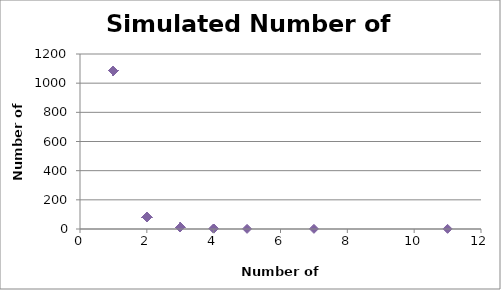
| Category | Simulated Number of Athletes |
|---|---|
| 11.0 | 1 |
| 7.0 | 1 |
| 5.0 | 1 |
| 4.0 | 3 |
| 4.0 | 3 |
| 4.0 | 3 |
| 3.0 | 12 |
| 3.0 | 12 |
| 3.0 | 12 |
| 3.0 | 12 |
| 3.0 | 12 |
| 3.0 | 12 |
| 3.0 | 12 |
| 3.0 | 12 |
| 3.0 | 12 |
| 3.0 | 12 |
| 3.0 | 12 |
| 3.0 | 12 |
| 2.0 | 81 |
| 2.0 | 81 |
| 2.0 | 81 |
| 2.0 | 81 |
| 2.0 | 81 |
| 2.0 | 81 |
| 2.0 | 81 |
| 2.0 | 81 |
| 2.0 | 81 |
| 2.0 | 81 |
| 2.0 | 81 |
| 2.0 | 81 |
| 2.0 | 81 |
| 2.0 | 81 |
| 2.0 | 81 |
| 2.0 | 81 |
| 2.0 | 81 |
| 2.0 | 81 |
| 2.0 | 81 |
| 2.0 | 81 |
| 2.0 | 81 |
| 2.0 | 81 |
| 2.0 | 81 |
| 2.0 | 81 |
| 2.0 | 81 |
| 2.0 | 81 |
| 2.0 | 81 |
| 2.0 | 81 |
| 2.0 | 81 |
| 2.0 | 81 |
| 2.0 | 81 |
| 2.0 | 81 |
| 2.0 | 81 |
| 2.0 | 81 |
| 2.0 | 81 |
| 2.0 | 81 |
| 2.0 | 81 |
| 2.0 | 81 |
| 2.0 | 81 |
| 2.0 | 81 |
| 2.0 | 81 |
| 2.0 | 81 |
| 2.0 | 81 |
| 2.0 | 81 |
| 2.0 | 81 |
| 2.0 | 81 |
| 2.0 | 81 |
| 2.0 | 81 |
| 2.0 | 81 |
| 2.0 | 81 |
| 2.0 | 81 |
| 2.0 | 81 |
| 2.0 | 81 |
| 2.0 | 81 |
| 2.0 | 81 |
| 2.0 | 81 |
| 2.0 | 81 |
| 2.0 | 81 |
| 2.0 | 81 |
| 2.0 | 81 |
| 2.0 | 81 |
| 2.0 | 81 |
| 2.0 | 81 |
| 2.0 | 81 |
| 2.0 | 81 |
| 2.0 | 81 |
| 2.0 | 81 |
| 2.0 | 81 |
| 2.0 | 81 |
| 2.0 | 81 |
| 2.0 | 81 |
| 2.0 | 81 |
| 2.0 | 81 |
| 2.0 | 81 |
| 2.0 | 81 |
| 2.0 | 81 |
| 2.0 | 81 |
| 2.0 | 81 |
| 2.0 | 81 |
| 2.0 | 81 |
| 2.0 | 81 |
| 1.0 | 1084 |
| 1.0 | 1084 |
| 1.0 | 1084 |
| 1.0 | 1084 |
| 1.0 | 1084 |
| 1.0 | 1084 |
| 1.0 | 1084 |
| 1.0 | 1084 |
| 1.0 | 1084 |
| 1.0 | 1084 |
| 1.0 | 1084 |
| 1.0 | 1084 |
| 1.0 | 1084 |
| 1.0 | 1084 |
| 1.0 | 1084 |
| 1.0 | 1084 |
| 1.0 | 1084 |
| 1.0 | 1084 |
| 1.0 | 1084 |
| 1.0 | 1084 |
| 1.0 | 1084 |
| 1.0 | 1084 |
| 1.0 | 1084 |
| 1.0 | 1084 |
| 1.0 | 1084 |
| 1.0 | 1084 |
| 1.0 | 1084 |
| 1.0 | 1084 |
| 1.0 | 1084 |
| 1.0 | 1084 |
| 1.0 | 1084 |
| 1.0 | 1084 |
| 1.0 | 1084 |
| 1.0 | 1084 |
| 1.0 | 1084 |
| 1.0 | 1084 |
| 1.0 | 1084 |
| 1.0 | 1084 |
| 1.0 | 1084 |
| 1.0 | 1084 |
| 1.0 | 1084 |
| 1.0 | 1084 |
| 1.0 | 1084 |
| 1.0 | 1084 |
| 1.0 | 1084 |
| 1.0 | 1084 |
| 1.0 | 1084 |
| 1.0 | 1084 |
| 1.0 | 1084 |
| 1.0 | 1084 |
| 1.0 | 1084 |
| 1.0 | 1084 |
| 1.0 | 1084 |
| 1.0 | 1084 |
| 1.0 | 1084 |
| 1.0 | 1084 |
| 1.0 | 1084 |
| 1.0 | 1084 |
| 1.0 | 1084 |
| 1.0 | 1084 |
| 1.0 | 1084 |
| 1.0 | 1084 |
| 1.0 | 1084 |
| 1.0 | 1084 |
| 1.0 | 1084 |
| 1.0 | 1084 |
| 1.0 | 1084 |
| 1.0 | 1084 |
| 1.0 | 1084 |
| 1.0 | 1084 |
| 1.0 | 1084 |
| 1.0 | 1084 |
| 1.0 | 1084 |
| 1.0 | 1084 |
| 1.0 | 1084 |
| 1.0 | 1084 |
| 1.0 | 1084 |
| 1.0 | 1084 |
| 1.0 | 1084 |
| 1.0 | 1084 |
| 1.0 | 1084 |
| 1.0 | 1084 |
| 1.0 | 1084 |
| 1.0 | 1084 |
| 1.0 | 1084 |
| 1.0 | 1084 |
| 1.0 | 1084 |
| 1.0 | 1084 |
| 1.0 | 1084 |
| 1.0 | 1084 |
| 1.0 | 1084 |
| 1.0 | 1084 |
| 1.0 | 1084 |
| 1.0 | 1084 |
| 1.0 | 1084 |
| 1.0 | 1084 |
| 1.0 | 1084 |
| 1.0 | 1084 |
| 1.0 | 1084 |
| 1.0 | 1084 |
| 1.0 | 1084 |
| 1.0 | 1084 |
| 1.0 | 1084 |
| 1.0 | 1084 |
| 1.0 | 1084 |
| 1.0 | 1084 |
| 1.0 | 1084 |
| 1.0 | 1084 |
| 1.0 | 1084 |
| 1.0 | 1084 |
| 1.0 | 1084 |
| 1.0 | 1084 |
| 1.0 | 1084 |
| 1.0 | 1084 |
| 1.0 | 1084 |
| 1.0 | 1084 |
| 1.0 | 1084 |
| 1.0 | 1084 |
| 1.0 | 1084 |
| 1.0 | 1084 |
| 1.0 | 1084 |
| 1.0 | 1084 |
| 1.0 | 1084 |
| 1.0 | 1084 |
| 1.0 | 1084 |
| 1.0 | 1084 |
| 1.0 | 1084 |
| 1.0 | 1084 |
| 1.0 | 1084 |
| 1.0 | 1084 |
| 1.0 | 1084 |
| 1.0 | 1084 |
| 1.0 | 1084 |
| 1.0 | 1084 |
| 1.0 | 1084 |
| 1.0 | 1084 |
| 1.0 | 1084 |
| 1.0 | 1084 |
| 1.0 | 1084 |
| 1.0 | 1084 |
| 1.0 | 1084 |
| 1.0 | 1084 |
| 1.0 | 1084 |
| 1.0 | 1084 |
| 1.0 | 1084 |
| 1.0 | 1084 |
| 1.0 | 1084 |
| 1.0 | 1084 |
| 1.0 | 1084 |
| 1.0 | 1084 |
| 1.0 | 1084 |
| 1.0 | 1084 |
| 1.0 | 1084 |
| 1.0 | 1084 |
| 1.0 | 1084 |
| 1.0 | 1084 |
| 1.0 | 1084 |
| 1.0 | 1084 |
| 1.0 | 1084 |
| 1.0 | 1084 |
| 1.0 | 1084 |
| 1.0 | 1084 |
| 1.0 | 1084 |
| 1.0 | 1084 |
| 1.0 | 1084 |
| 1.0 | 1084 |
| 1.0 | 1084 |
| 1.0 | 1084 |
| 1.0 | 1084 |
| 1.0 | 1084 |
| 1.0 | 1084 |
| 1.0 | 1084 |
| 1.0 | 1084 |
| 1.0 | 1084 |
| 1.0 | 1084 |
| 1.0 | 1084 |
| 1.0 | 1084 |
| 1.0 | 1084 |
| 1.0 | 1084 |
| 1.0 | 1084 |
| 1.0 | 1084 |
| 1.0 | 1084 |
| 1.0 | 1084 |
| 1.0 | 1084 |
| 1.0 | 1084 |
| 1.0 | 1084 |
| 1.0 | 1084 |
| 1.0 | 1084 |
| 1.0 | 1084 |
| 1.0 | 1084 |
| 1.0 | 1084 |
| 1.0 | 1084 |
| 1.0 | 1084 |
| 1.0 | 1084 |
| 1.0 | 1084 |
| 1.0 | 1084 |
| 1.0 | 1084 |
| 1.0 | 1084 |
| 1.0 | 1084 |
| 1.0 | 1084 |
| 1.0 | 1084 |
| 1.0 | 1084 |
| 1.0 | 1084 |
| 1.0 | 1084 |
| 1.0 | 1084 |
| 1.0 | 1084 |
| 1.0 | 1084 |
| 1.0 | 1084 |
| 1.0 | 1084 |
| 1.0 | 1084 |
| 1.0 | 1084 |
| 1.0 | 1084 |
| 1.0 | 1084 |
| 1.0 | 1084 |
| 1.0 | 1084 |
| 1.0 | 1084 |
| 1.0 | 1084 |
| 1.0 | 1084 |
| 1.0 | 1084 |
| 1.0 | 1084 |
| 1.0 | 1084 |
| 1.0 | 1084 |
| 1.0 | 1084 |
| 1.0 | 1084 |
| 1.0 | 1084 |
| 1.0 | 1084 |
| 1.0 | 1084 |
| 1.0 | 1084 |
| 1.0 | 1084 |
| 1.0 | 1084 |
| 1.0 | 1084 |
| 1.0 | 1084 |
| 1.0 | 1084 |
| 1.0 | 1084 |
| 1.0 | 1084 |
| 1.0 | 1084 |
| 1.0 | 1084 |
| 1.0 | 1084 |
| 1.0 | 1084 |
| 1.0 | 1084 |
| 1.0 | 1084 |
| 1.0 | 1084 |
| 1.0 | 1084 |
| 1.0 | 1084 |
| 1.0 | 1084 |
| 1.0 | 1084 |
| 1.0 | 1084 |
| 1.0 | 1084 |
| 1.0 | 1084 |
| 1.0 | 1084 |
| 1.0 | 1084 |
| 1.0 | 1084 |
| 1.0 | 1084 |
| 1.0 | 1084 |
| 1.0 | 1084 |
| 1.0 | 1084 |
| 1.0 | 1084 |
| 1.0 | 1084 |
| 1.0 | 1084 |
| 1.0 | 1084 |
| 1.0 | 1084 |
| 1.0 | 1084 |
| 1.0 | 1084 |
| 1.0 | 1084 |
| 1.0 | 1084 |
| 1.0 | 1084 |
| 1.0 | 1084 |
| 1.0 | 1084 |
| 1.0 | 1084 |
| 1.0 | 1084 |
| 1.0 | 1084 |
| 1.0 | 1084 |
| 1.0 | 1084 |
| 1.0 | 1084 |
| 1.0 | 1084 |
| 1.0 | 1084 |
| 1.0 | 1084 |
| 1.0 | 1084 |
| 1.0 | 1084 |
| 1.0 | 1084 |
| 1.0 | 1084 |
| 1.0 | 1084 |
| 1.0 | 1084 |
| 1.0 | 1084 |
| 1.0 | 1084 |
| 1.0 | 1084 |
| 1.0 | 1084 |
| 1.0 | 1084 |
| 1.0 | 1084 |
| 1.0 | 1084 |
| 1.0 | 1084 |
| 1.0 | 1084 |
| 1.0 | 1084 |
| 1.0 | 1084 |
| 1.0 | 1084 |
| 1.0 | 1084 |
| 1.0 | 1084 |
| 1.0 | 1084 |
| 1.0 | 1084 |
| 1.0 | 1084 |
| 1.0 | 1084 |
| 1.0 | 1084 |
| 1.0 | 1084 |
| 1.0 | 1084 |
| 1.0 | 1084 |
| 1.0 | 1084 |
| 1.0 | 1084 |
| 1.0 | 1084 |
| 1.0 | 1084 |
| 1.0 | 1084 |
| 1.0 | 1084 |
| 1.0 | 1084 |
| 1.0 | 1084 |
| 1.0 | 1084 |
| 1.0 | 1084 |
| 1.0 | 1084 |
| 1.0 | 1084 |
| 1.0 | 1084 |
| 1.0 | 1084 |
| 1.0 | 1084 |
| 1.0 | 1084 |
| 1.0 | 1084 |
| 1.0 | 1084 |
| 1.0 | 1084 |
| 1.0 | 1084 |
| 1.0 | 1084 |
| 1.0 | 1084 |
| 1.0 | 1084 |
| 1.0 | 1084 |
| 1.0 | 1084 |
| 1.0 | 1084 |
| 1.0 | 1084 |
| 1.0 | 1084 |
| 1.0 | 1084 |
| 1.0 | 1084 |
| 1.0 | 1084 |
| 1.0 | 1084 |
| 1.0 | 1084 |
| 1.0 | 1084 |
| 1.0 | 1084 |
| 1.0 | 1084 |
| 1.0 | 1084 |
| 1.0 | 1084 |
| 1.0 | 1084 |
| 1.0 | 1084 |
| 1.0 | 1084 |
| 1.0 | 1084 |
| 1.0 | 1084 |
| 1.0 | 1084 |
| 1.0 | 1084 |
| 1.0 | 1084 |
| 1.0 | 1084 |
| 1.0 | 1084 |
| 1.0 | 1084 |
| 1.0 | 1084 |
| 1.0 | 1084 |
| 1.0 | 1084 |
| 1.0 | 1084 |
| 1.0 | 1084 |
| 1.0 | 1084 |
| 1.0 | 1084 |
| 1.0 | 1084 |
| 1.0 | 1084 |
| 1.0 | 1084 |
| 1.0 | 1084 |
| 1.0 | 1084 |
| 1.0 | 1084 |
| 1.0 | 1084 |
| 1.0 | 1084 |
| 1.0 | 1084 |
| 1.0 | 1084 |
| 1.0 | 1084 |
| 1.0 | 1084 |
| 1.0 | 1084 |
| 1.0 | 1084 |
| 1.0 | 1084 |
| 1.0 | 1084 |
| 1.0 | 1084 |
| 1.0 | 1084 |
| 1.0 | 1084 |
| 1.0 | 1084 |
| 1.0 | 1084 |
| 1.0 | 1084 |
| 1.0 | 1084 |
| 1.0 | 1084 |
| 1.0 | 1084 |
| 1.0 | 1084 |
| 1.0 | 1084 |
| 1.0 | 1084 |
| 1.0 | 1084 |
| 1.0 | 1084 |
| 1.0 | 1084 |
| 1.0 | 1084 |
| 1.0 | 1084 |
| 1.0 | 1084 |
| 1.0 | 1084 |
| 1.0 | 1084 |
| 1.0 | 1084 |
| 1.0 | 1084 |
| 1.0 | 1084 |
| 1.0 | 1084 |
| 1.0 | 1084 |
| 1.0 | 1084 |
| 1.0 | 1084 |
| 1.0 | 1084 |
| 1.0 | 1084 |
| 1.0 | 1084 |
| 1.0 | 1084 |
| 1.0 | 1084 |
| 1.0 | 1084 |
| 1.0 | 1084 |
| 1.0 | 1084 |
| 1.0 | 1084 |
| 1.0 | 1084 |
| 1.0 | 1084 |
| 1.0 | 1084 |
| 1.0 | 1084 |
| 1.0 | 1084 |
| 1.0 | 1084 |
| 1.0 | 1084 |
| 1.0 | 1084 |
| 1.0 | 1084 |
| 1.0 | 1084 |
| 1.0 | 1084 |
| 1.0 | 1084 |
| 1.0 | 1084 |
| 1.0 | 1084 |
| 1.0 | 1084 |
| 1.0 | 1084 |
| 1.0 | 1084 |
| 1.0 | 1084 |
| 1.0 | 1084 |
| 1.0 | 1084 |
| 1.0 | 1084 |
| 1.0 | 1084 |
| 1.0 | 1084 |
| 1.0 | 1084 |
| 1.0 | 1084 |
| 1.0 | 1084 |
| 1.0 | 1084 |
| 1.0 | 1084 |
| 1.0 | 1084 |
| 1.0 | 1084 |
| 1.0 | 1084 |
| 1.0 | 1084 |
| 1.0 | 1084 |
| 1.0 | 1084 |
| 1.0 | 1084 |
| 1.0 | 1084 |
| 1.0 | 1084 |
| 1.0 | 1084 |
| 1.0 | 1084 |
| 1.0 | 1084 |
| 1.0 | 1084 |
| 1.0 | 1084 |
| 1.0 | 1084 |
| 1.0 | 1084 |
| 1.0 | 1084 |
| 1.0 | 1084 |
| 1.0 | 1084 |
| 1.0 | 1084 |
| 1.0 | 1084 |
| 1.0 | 1084 |
| 1.0 | 1084 |
| 1.0 | 1084 |
| 1.0 | 1084 |
| 1.0 | 1084 |
| 1.0 | 1084 |
| 1.0 | 1084 |
| 1.0 | 1084 |
| 1.0 | 1084 |
| 1.0 | 1084 |
| 1.0 | 1084 |
| 1.0 | 1084 |
| 1.0 | 1084 |
| 1.0 | 1084 |
| 1.0 | 1084 |
| 1.0 | 1084 |
| 1.0 | 1084 |
| 1.0 | 1084 |
| 1.0 | 1084 |
| 1.0 | 1084 |
| 1.0 | 1084 |
| 1.0 | 1084 |
| 1.0 | 1084 |
| 1.0 | 1084 |
| 1.0 | 1084 |
| 1.0 | 1084 |
| 1.0 | 1084 |
| 1.0 | 1084 |
| 1.0 | 1084 |
| 1.0 | 1084 |
| 1.0 | 1084 |
| 1.0 | 1084 |
| 1.0 | 1084 |
| 1.0 | 1084 |
| 1.0 | 1084 |
| 1.0 | 1084 |
| 1.0 | 1084 |
| 1.0 | 1084 |
| 1.0 | 1084 |
| 1.0 | 1084 |
| 1.0 | 1084 |
| 1.0 | 1084 |
| 1.0 | 1084 |
| 1.0 | 1084 |
| 1.0 | 1084 |
| 1.0 | 1084 |
| 1.0 | 1084 |
| 1.0 | 1084 |
| 1.0 | 1084 |
| 1.0 | 1084 |
| 1.0 | 1084 |
| 1.0 | 1084 |
| 1.0 | 1084 |
| 1.0 | 1084 |
| 1.0 | 1084 |
| 1.0 | 1084 |
| 1.0 | 1084 |
| 1.0 | 1084 |
| 1.0 | 1084 |
| 1.0 | 1084 |
| 1.0 | 1084 |
| 1.0 | 1084 |
| 1.0 | 1084 |
| 1.0 | 1084 |
| 1.0 | 1084 |
| 1.0 | 1084 |
| 1.0 | 1084 |
| 1.0 | 1084 |
| 1.0 | 1084 |
| 1.0 | 1084 |
| 1.0 | 1084 |
| 1.0 | 1084 |
| 1.0 | 1084 |
| 1.0 | 1084 |
| 1.0 | 1084 |
| 1.0 | 1084 |
| 1.0 | 1084 |
| 1.0 | 1084 |
| 1.0 | 1084 |
| 1.0 | 1084 |
| 1.0 | 1084 |
| 1.0 | 1084 |
| 1.0 | 1084 |
| 1.0 | 1084 |
| 1.0 | 1084 |
| 1.0 | 1084 |
| 1.0 | 1084 |
| 1.0 | 1084 |
| 1.0 | 1084 |
| 1.0 | 1084 |
| 1.0 | 1084 |
| 1.0 | 1084 |
| 1.0 | 1084 |
| 1.0 | 1084 |
| 1.0 | 1084 |
| 1.0 | 1084 |
| 1.0 | 1084 |
| 1.0 | 1084 |
| 1.0 | 1084 |
| 1.0 | 1084 |
| 1.0 | 1084 |
| 1.0 | 1084 |
| 1.0 | 1084 |
| 1.0 | 1084 |
| 1.0 | 1084 |
| 1.0 | 1084 |
| 1.0 | 1084 |
| 1.0 | 1084 |
| 1.0 | 1084 |
| 1.0 | 1084 |
| 1.0 | 1084 |
| 1.0 | 1084 |
| 1.0 | 1084 |
| 1.0 | 1084 |
| 1.0 | 1084 |
| 1.0 | 1084 |
| 1.0 | 1084 |
| 1.0 | 1084 |
| 1.0 | 1084 |
| 1.0 | 1084 |
| 1.0 | 1084 |
| 1.0 | 1084 |
| 1.0 | 1084 |
| 1.0 | 1084 |
| 1.0 | 1084 |
| 1.0 | 1084 |
| 1.0 | 1084 |
| 1.0 | 1084 |
| 1.0 | 1084 |
| 1.0 | 1084 |
| 1.0 | 1084 |
| 1.0 | 1084 |
| 1.0 | 1084 |
| 1.0 | 1084 |
| 1.0 | 1084 |
| 1.0 | 1084 |
| 1.0 | 1084 |
| 1.0 | 1084 |
| 1.0 | 1084 |
| 1.0 | 1084 |
| 1.0 | 1084 |
| 1.0 | 1084 |
| 1.0 | 1084 |
| 1.0 | 1084 |
| 1.0 | 1084 |
| 1.0 | 1084 |
| 1.0 | 1084 |
| 1.0 | 1084 |
| 1.0 | 1084 |
| 1.0 | 1084 |
| 1.0 | 1084 |
| 1.0 | 1084 |
| 1.0 | 1084 |
| 1.0 | 1084 |
| 1.0 | 1084 |
| 1.0 | 1084 |
| 1.0 | 1084 |
| 1.0 | 1084 |
| 1.0 | 1084 |
| 1.0 | 1084 |
| 1.0 | 1084 |
| 1.0 | 1084 |
| 1.0 | 1084 |
| 1.0 | 1084 |
| 1.0 | 1084 |
| 1.0 | 1084 |
| 1.0 | 1084 |
| 1.0 | 1084 |
| 1.0 | 1084 |
| 1.0 | 1084 |
| 1.0 | 1084 |
| 1.0 | 1084 |
| 1.0 | 1084 |
| 1.0 | 1084 |
| 1.0 | 1084 |
| 1.0 | 1084 |
| 1.0 | 1084 |
| 1.0 | 1084 |
| 1.0 | 1084 |
| 1.0 | 1084 |
| 1.0 | 1084 |
| 1.0 | 1084 |
| 1.0 | 1084 |
| 1.0 | 1084 |
| 1.0 | 1084 |
| 1.0 | 1084 |
| 1.0 | 1084 |
| 1.0 | 1084 |
| 1.0 | 1084 |
| 1.0 | 1084 |
| 1.0 | 1084 |
| 1.0 | 1084 |
| 1.0 | 1084 |
| 1.0 | 1084 |
| 1.0 | 1084 |
| 1.0 | 1084 |
| 1.0 | 1084 |
| 1.0 | 1084 |
| 1.0 | 1084 |
| 1.0 | 1084 |
| 1.0 | 1084 |
| 1.0 | 1084 |
| 1.0 | 1084 |
| 1.0 | 1084 |
| 1.0 | 1084 |
| 1.0 | 1084 |
| 1.0 | 1084 |
| 1.0 | 1084 |
| 1.0 | 1084 |
| 1.0 | 1084 |
| 1.0 | 1084 |
| 1.0 | 1084 |
| 1.0 | 1084 |
| 1.0 | 1084 |
| 1.0 | 1084 |
| 1.0 | 1084 |
| 1.0 | 1084 |
| 1.0 | 1084 |
| 1.0 | 1084 |
| 1.0 | 1084 |
| 1.0 | 1084 |
| 1.0 | 1084 |
| 1.0 | 1084 |
| 1.0 | 1084 |
| 1.0 | 1084 |
| 1.0 | 1084 |
| 1.0 | 1084 |
| 1.0 | 1084 |
| 1.0 | 1084 |
| 1.0 | 1084 |
| 1.0 | 1084 |
| 1.0 | 1084 |
| 1.0 | 1084 |
| 1.0 | 1084 |
| 1.0 | 1084 |
| 1.0 | 1084 |
| 1.0 | 1084 |
| 1.0 | 1084 |
| 1.0 | 1084 |
| 1.0 | 1084 |
| 1.0 | 1084 |
| 1.0 | 1084 |
| 1.0 | 1084 |
| 1.0 | 1084 |
| 1.0 | 1084 |
| 1.0 | 1084 |
| 1.0 | 1084 |
| 1.0 | 1084 |
| 1.0 | 1084 |
| 1.0 | 1084 |
| 1.0 | 1084 |
| 1.0 | 1084 |
| 1.0 | 1084 |
| 1.0 | 1084 |
| 1.0 | 1084 |
| 1.0 | 1084 |
| 1.0 | 1084 |
| 1.0 | 1084 |
| 1.0 | 1084 |
| 1.0 | 1084 |
| 1.0 | 1084 |
| 1.0 | 1084 |
| 1.0 | 1084 |
| 1.0 | 1084 |
| 1.0 | 1084 |
| 1.0 | 1084 |
| 1.0 | 1084 |
| 1.0 | 1084 |
| 1.0 | 1084 |
| 1.0 | 1084 |
| 1.0 | 1084 |
| 1.0 | 1084 |
| 1.0 | 1084 |
| 1.0 | 1084 |
| 1.0 | 1084 |
| 1.0 | 1084 |
| 1.0 | 1084 |
| 1.0 | 1084 |
| 1.0 | 1084 |
| 1.0 | 1084 |
| 1.0 | 1084 |
| 1.0 | 1084 |
| 1.0 | 1084 |
| 1.0 | 1084 |
| 1.0 | 1084 |
| 1.0 | 1084 |
| 1.0 | 1084 |
| 1.0 | 1084 |
| 1.0 | 1084 |
| 1.0 | 1084 |
| 1.0 | 1084 |
| 1.0 | 1084 |
| 1.0 | 1084 |
| 1.0 | 1084 |
| 1.0 | 1084 |
| 1.0 | 1084 |
| 1.0 | 1084 |
| 1.0 | 1084 |
| 1.0 | 1084 |
| 1.0 | 1084 |
| 1.0 | 1084 |
| 1.0 | 1084 |
| 1.0 | 1084 |
| 1.0 | 1084 |
| 1.0 | 1084 |
| 1.0 | 1084 |
| 1.0 | 1084 |
| 1.0 | 1084 |
| 1.0 | 1084 |
| 1.0 | 1084 |
| 1.0 | 1084 |
| 1.0 | 1084 |
| 1.0 | 1084 |
| 1.0 | 1084 |
| 1.0 | 1084 |
| 1.0 | 1084 |
| 1.0 | 1084 |
| 1.0 | 1084 |
| 1.0 | 1084 |
| 1.0 | 1084 |
| 1.0 | 1084 |
| 1.0 | 1084 |
| 1.0 | 1084 |
| 1.0 | 1084 |
| 1.0 | 1084 |
| 1.0 | 1084 |
| 1.0 | 1084 |
| 1.0 | 1084 |
| 1.0 | 1084 |
| 1.0 | 1084 |
| 1.0 | 1084 |
| 1.0 | 1084 |
| 1.0 | 1084 |
| 1.0 | 1084 |
| 1.0 | 1084 |
| 1.0 | 1084 |
| 1.0 | 1084 |
| 1.0 | 1084 |
| 1.0 | 1084 |
| 1.0 | 1084 |
| 1.0 | 1084 |
| 1.0 | 1084 |
| 1.0 | 1084 |
| 1.0 | 1084 |
| 1.0 | 1084 |
| 1.0 | 1084 |
| 1.0 | 1084 |
| 1.0 | 1084 |
| 1.0 | 1084 |
| 1.0 | 1084 |
| 1.0 | 1084 |
| 1.0 | 1084 |
| 1.0 | 1084 |
| 1.0 | 1084 |
| 1.0 | 1084 |
| 1.0 | 1084 |
| 1.0 | 1084 |
| 1.0 | 1084 |
| 1.0 | 1084 |
| 1.0 | 1084 |
| 1.0 | 1084 |
| 1.0 | 1084 |
| 1.0 | 1084 |
| 1.0 | 1084 |
| 1.0 | 1084 |
| 1.0 | 1084 |
| 1.0 | 1084 |
| 1.0 | 1084 |
| 1.0 | 1084 |
| 1.0 | 1084 |
| 1.0 | 1084 |
| 1.0 | 1084 |
| 1.0 | 1084 |
| 1.0 | 1084 |
| 1.0 | 1084 |
| 1.0 | 1084 |
| 1.0 | 1084 |
| 1.0 | 1084 |
| 1.0 | 1084 |
| 1.0 | 1084 |
| 1.0 | 1084 |
| 1.0 | 1084 |
| 1.0 | 1084 |
| 1.0 | 1084 |
| 1.0 | 1084 |
| 1.0 | 1084 |
| 1.0 | 1084 |
| 1.0 | 1084 |
| 1.0 | 1084 |
| 1.0 | 1084 |
| 1.0 | 1084 |
| 1.0 | 1084 |
| 1.0 | 1084 |
| 1.0 | 1084 |
| 1.0 | 1084 |
| 1.0 | 1084 |
| 1.0 | 1084 |
| 1.0 | 1084 |
| 1.0 | 1084 |
| 1.0 | 1084 |
| 1.0 | 1084 |
| 1.0 | 1084 |
| 1.0 | 1084 |
| 1.0 | 1084 |
| 1.0 | 1084 |
| 1.0 | 1084 |
| 1.0 | 1084 |
| 1.0 | 1084 |
| 1.0 | 1084 |
| 1.0 | 1084 |
| 1.0 | 1084 |
| 1.0 | 1084 |
| 1.0 | 1084 |
| 1.0 | 1084 |
| 1.0 | 1084 |
| 1.0 | 1084 |
| 1.0 | 1084 |
| 1.0 | 1084 |
| 1.0 | 1084 |
| 1.0 | 1084 |
| 1.0 | 1084 |
| 1.0 | 1084 |
| 1.0 | 1084 |
| 1.0 | 1084 |
| 1.0 | 1084 |
| 1.0 | 1084 |
| 1.0 | 1084 |
| 1.0 | 1084 |
| 1.0 | 1084 |
| 1.0 | 1084 |
| 1.0 | 1084 |
| 1.0 | 1084 |
| 1.0 | 1084 |
| 1.0 | 1084 |
| 1.0 | 1084 |
| 1.0 | 1084 |
| 1.0 | 1084 |
| 1.0 | 1084 |
| 1.0 | 1084 |
| 1.0 | 1084 |
| 1.0 | 1084 |
| 1.0 | 1084 |
| 1.0 | 1084 |
| 1.0 | 1084 |
| 1.0 | 1084 |
| 1.0 | 1084 |
| 1.0 | 1084 |
| 1.0 | 1084 |
| 1.0 | 1084 |
| 1.0 | 1084 |
| 1.0 | 1084 |
| 1.0 | 1084 |
| 1.0 | 1084 |
| 1.0 | 1084 |
| 1.0 | 1084 |
| 1.0 | 1084 |
| 1.0 | 1084 |
| 1.0 | 1084 |
| 1.0 | 1084 |
| 1.0 | 1084 |
| 1.0 | 1084 |
| 1.0 | 1084 |
| 1.0 | 1084 |
| 1.0 | 1084 |
| 1.0 | 1084 |
| 1.0 | 1084 |
| 1.0 | 1084 |
| 1.0 | 1084 |
| 1.0 | 1084 |
| 1.0 | 1084 |
| 1.0 | 1084 |
| 1.0 | 1084 |
| 1.0 | 1084 |
| 1.0 | 1084 |
| 1.0 | 1084 |
| 1.0 | 1084 |
| 1.0 | 1084 |
| 1.0 | 1084 |
| 1.0 | 1084 |
| 1.0 | 1084 |
| 1.0 | 1084 |
| 1.0 | 1084 |
| 1.0 | 1084 |
| 1.0 | 1084 |
| 1.0 | 1084 |
| 1.0 | 1084 |
| 1.0 | 1084 |
| 1.0 | 1084 |
| 1.0 | 1084 |
| 1.0 | 1084 |
| 1.0 | 1084 |
| 1.0 | 1084 |
| 1.0 | 1084 |
| 1.0 | 1084 |
| 1.0 | 1084 |
| 1.0 | 1084 |
| 1.0 | 1084 |
| 1.0 | 1084 |
| 1.0 | 1084 |
| 1.0 | 1084 |
| 1.0 | 1084 |
| 1.0 | 1084 |
| 1.0 | 1084 |
| 1.0 | 1084 |
| 1.0 | 1084 |
| 1.0 | 1084 |
| 1.0 | 1084 |
| 1.0 | 1084 |
| 1.0 | 1084 |
| 1.0 | 1084 |
| 1.0 | 1084 |
| 1.0 | 1084 |
| 1.0 | 1084 |
| 1.0 | 1084 |
| 1.0 | 1084 |
| 1.0 | 1084 |
| 1.0 | 1084 |
| 1.0 | 1084 |
| 1.0 | 1084 |
| 1.0 | 1084 |
| 1.0 | 1084 |
| 1.0 | 1084 |
| 1.0 | 1084 |
| 1.0 | 1084 |
| 1.0 | 1084 |
| 1.0 | 1084 |
| 1.0 | 1084 |
| 1.0 | 1084 |
| 1.0 | 1084 |
| 1.0 | 1084 |
| 1.0 | 1084 |
| 1.0 | 1084 |
| 1.0 | 1084 |
| 1.0 | 1084 |
| 1.0 | 1084 |
| 1.0 | 1084 |
| 1.0 | 1084 |
| 1.0 | 1084 |
| 1.0 | 1084 |
| 1.0 | 1084 |
| 1.0 | 1084 |
| 1.0 | 1084 |
| 1.0 | 1084 |
| 1.0 | 1084 |
| 1.0 | 1084 |
| 1.0 | 1084 |
| 1.0 | 1084 |
| 1.0 | 1084 |
| 1.0 | 1084 |
| 1.0 | 1084 |
| 1.0 | 1084 |
| 1.0 | 1084 |
| 1.0 | 1084 |
| 1.0 | 1084 |
| 1.0 | 1084 |
| 1.0 | 1084 |
| 1.0 | 1084 |
| 1.0 | 1084 |
| 1.0 | 1084 |
| 1.0 | 1084 |
| 1.0 | 1084 |
| 1.0 | 1084 |
| 1.0 | 1084 |
| 1.0 | 1084 |
| 1.0 | 1084 |
| 1.0 | 1084 |
| 1.0 | 1084 |
| 1.0 | 1084 |
| 1.0 | 1084 |
| 1.0 | 1084 |
| 1.0 | 1084 |
| 1.0 | 1084 |
| 1.0 | 1084 |
| 1.0 | 1084 |
| 1.0 | 1084 |
| 1.0 | 1084 |
| 1.0 | 1084 |
| 1.0 | 1084 |
| 1.0 | 1084 |
| 1.0 | 1084 |
| 1.0 | 1084 |
| 1.0 | 1084 |
| 1.0 | 1084 |
| 1.0 | 1084 |
| 1.0 | 1084 |
| 1.0 | 1084 |
| 1.0 | 1084 |
| 1.0 | 1084 |
| 1.0 | 1084 |
| 1.0 | 1084 |
| 1.0 | 1084 |
| 1.0 | 1084 |
| 1.0 | 1084 |
| 1.0 | 1084 |
| 1.0 | 1084 |
| 1.0 | 1084 |
| 1.0 | 1084 |
| 1.0 | 1084 |
| 1.0 | 1084 |
| 1.0 | 1084 |
| 1.0 | 1084 |
| 1.0 | 1084 |
| 1.0 | 1084 |
| 1.0 | 1084 |
| 1.0 | 1084 |
| 1.0 | 1084 |
| 1.0 | 1084 |
| 1.0 | 1084 |
| 1.0 | 1084 |
| 1.0 | 1084 |
| 1.0 | 1084 |
| 1.0 | 1084 |
| 1.0 | 1084 |
| 1.0 | 1084 |
| 1.0 | 1084 |
| 1.0 | 1084 |
| 1.0 | 1084 |
| 1.0 | 1084 |
| 1.0 | 1084 |
| 1.0 | 1084 |
| 1.0 | 1084 |
| 1.0 | 1084 |